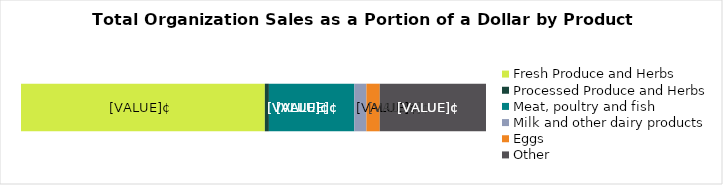
| Category | Fresh Produce and Herbs | Processed Produce and Herbs | Meat, poultry and fish | Milk and other dairy products | Eggs | Other |
|---|---|---|---|---|---|---|
| Total | 52.442 | 0.872 | 18.359 | 2.611 | 2.872 | 22.843 |